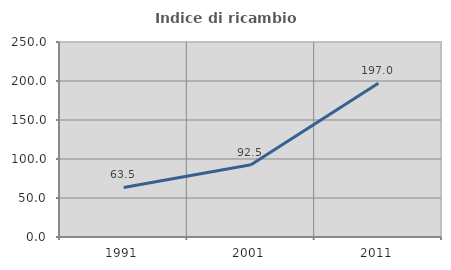
| Category | Indice di ricambio occupazionale  |
|---|---|
| 1991.0 | 63.484 |
| 2001.0 | 92.511 |
| 2011.0 | 197.041 |